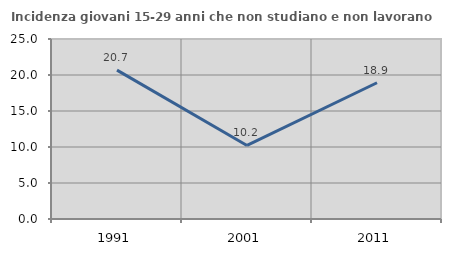
| Category | Incidenza giovani 15-29 anni che non studiano e non lavorano  |
|---|---|
| 1991.0 | 20.677 |
| 2001.0 | 10.219 |
| 2011.0 | 18.927 |